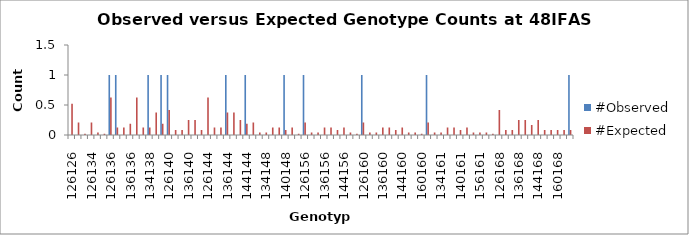
| Category | #Observed | #Expected |
|---|---|---|
| 126126.0 | 0 | 0.521 |
| 126132.0 | 0 | 0.208 |
| 132132.0 | 0 | 0.021 |
| 126134.0 | 0 | 0.208 |
| 132134.0 | 0 | 0.042 |
| 134134.0 | 0 | 0.021 |
| 126136.0 | 1 | 0.625 |
| 132136.0 | 1 | 0.125 |
| 134136.0 | 0 | 0.125 |
| 136136.0 | 0 | 0.188 |
| 126138.0 | 0 | 0.625 |
| 132138.0 | 0 | 0.125 |
| 134138.0 | 1 | 0.125 |
| 136138.0 | 0 | 0.375 |
| 138138.0 | 1 | 0.188 |
| 126140.0 | 1 | 0.417 |
| 132140.0 | 0 | 0.083 |
| 134140.0 | 0 | 0.083 |
| 136140.0 | 0 | 0.25 |
| 138140.0 | 0 | 0.25 |
| 140140.0 | 0 | 0.083 |
| 126144.0 | 0 | 0.625 |
| 132144.0 | 0 | 0.125 |
| 134144.0 | 0 | 0.125 |
| 136144.0 | 1 | 0.375 |
| 138144.0 | 0 | 0.375 |
| 140144.0 | 0 | 0.25 |
| 144144.0 | 1 | 0.188 |
| 126148.0 | 0 | 0.208 |
| 132148.0 | 0 | 0.042 |
| 134148.0 | 0 | 0.042 |
| 136148.0 | 0 | 0.125 |
| 138148.0 | 0 | 0.125 |
| 140148.0 | 1 | 0.083 |
| 144148.0 | 0 | 0.125 |
| 148148.0 | 0 | 0.021 |
| 126156.0 | 1 | 0.208 |
| 132156.0 | 0 | 0.042 |
| 134156.0 | 0 | 0.042 |
| 136156.0 | 0 | 0.125 |
| 138156.0 | 0 | 0.125 |
| 140156.0 | 0 | 0.083 |
| 144156.0 | 0 | 0.125 |
| 148156.0 | 0 | 0.042 |
| 156156.0 | 0 | 0.021 |
| 126160.0 | 1 | 0.208 |
| 132160.0 | 0 | 0.042 |
| 134160.0 | 0 | 0.042 |
| 136160.0 | 0 | 0.125 |
| 138160.0 | 0 | 0.125 |
| 140160.0 | 0 | 0.083 |
| 144160.0 | 0 | 0.125 |
| 148160.0 | 0 | 0.042 |
| 156160.0 | 0 | 0.042 |
| 160160.0 | 0 | 0.021 |
| 126161.0 | 1 | 0.208 |
| 132161.0 | 0 | 0.042 |
| 134161.0 | 0 | 0.042 |
| 136161.0 | 0 | 0.125 |
| 138161.0 | 0 | 0.125 |
| 140161.0 | 0 | 0.083 |
| 144161.0 | 0 | 0.125 |
| 148161.0 | 0 | 0.042 |
| 156161.0 | 0 | 0.042 |
| 160161.0 | 0 | 0.042 |
| 161161.0 | 0 | 0.021 |
| 126168.0 | 0 | 0.417 |
| 132168.0 | 0 | 0.083 |
| 134168.0 | 0 | 0.083 |
| 136168.0 | 0 | 0.25 |
| 138168.0 | 0 | 0.25 |
| 140168.0 | 0 | 0.167 |
| 144168.0 | 0 | 0.25 |
| 148168.0 | 0 | 0.083 |
| 156168.0 | 0 | 0.083 |
| 160168.0 | 0 | 0.083 |
| 161168.0 | 0 | 0.083 |
| 168168.0 | 1 | 0.083 |